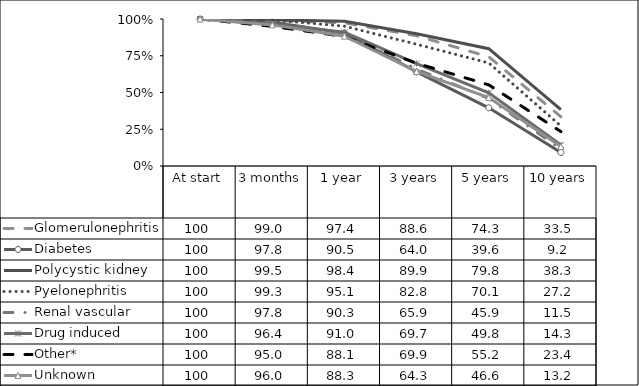
| Category | Glomerulonephritis | Diabetes | Polycystic kidney | Pyelonephritis | Renal vascular | Drug induced | Other* | Unknown |
|---|---|---|---|---|---|---|---|---|
| At start | 100 | 100 | 100 | 100 | 100 | 100 | 100 | 100 |
| 3 months | 99 | 97.8 | 99.5 | 99.3 | 97.8 | 96.4 | 95 | 96 |
| 1 year | 97.4 | 90.5 | 98.4 | 95.1 | 90.3 | 91 | 88.1 | 88.3 |
| 3 years | 88.6 | 64 | 89.9 | 82.8 | 65.9 | 69.7 | 69.9 | 64.3 |
| 5 years | 74.3 | 39.6 | 79.8 | 70.1 | 45.9 | 49.8 | 55.2 | 46.6 |
| 10 years | 33.5 | 9.2 | 38.3 | 27.2 | 11.5 | 14.3 | 23.4 | 13.2 |